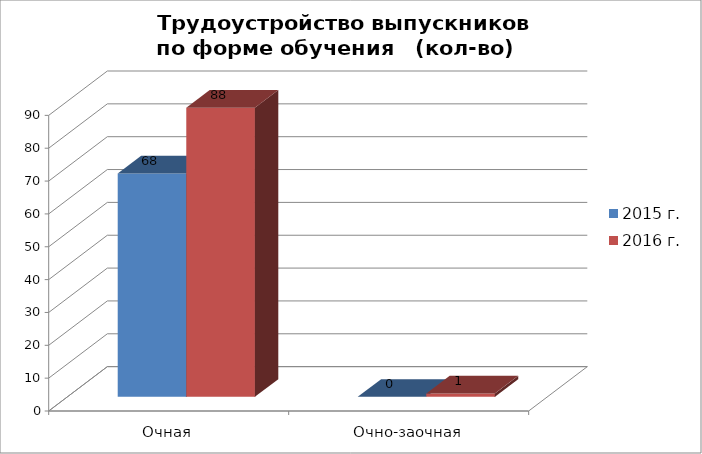
| Category | 2015 г. | 2016 г. |
|---|---|---|
| Очная | 68 | 88 |
| Очно-заочная | 0 | 1 |